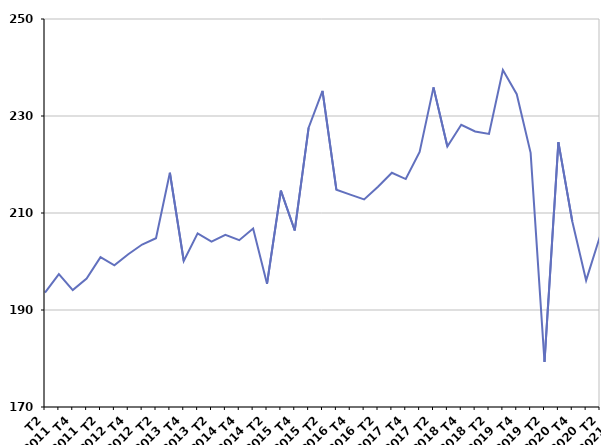
| Category | Cessation d'inscription pour défaut d'actualisation |
|---|---|
| T2
2011 | 193.6 |
| T3
2011 | 197.4 |
| T4
2011 | 194.1 |
| T1
2012 | 196.5 |
| T2
2012 | 200.9 |
| T3
2012 | 199.2 |
| T4
2012 | 201.5 |
| T1
2013 | 203.5 |
| T2
2013 | 204.8 |
| T3
2013 | 218.3 |
| T4
2013 | 200.1 |
| T1
2014 | 205.8 |
| T2
2014 | 204.1 |
| T3
2014 | 205.5 |
| T4
2014 | 204.4 |
| T1
2015 | 206.8 |
| T2
2015 | 195.4 |
| T3
2015 | 214.6 |
| T4
2015 | 206.4 |
| T1
2016 | 227.6 |
| T2
2016 | 235.2 |
| T3
2016 | 214.8 |
| T4
2016 | 213.8 |
| T1
2017 | 212.8 |
| T2
2017 | 215.4 |
| T3
2017 | 218.3 |
| T4
2017 | 217 |
| T1
2018 | 222.6 |
| T2
2018 | 235.9 |
| T3
2018 | 223.7 |
| T4
2018 | 228.2 |
| T1
2019 | 226.8 |
| T2
2019 | 226.3 |
| T3
2019 | 239.5 |
| T4
2019 | 234.5 |
| T1
2020 | 222.4 |
| T2
2020 | 179.3 |
| T3
2020 | 224.6 |
| T4
2020 | 208.3 |
| T1
2021 | 196.1 |
| T2
2021 | 205.2 |